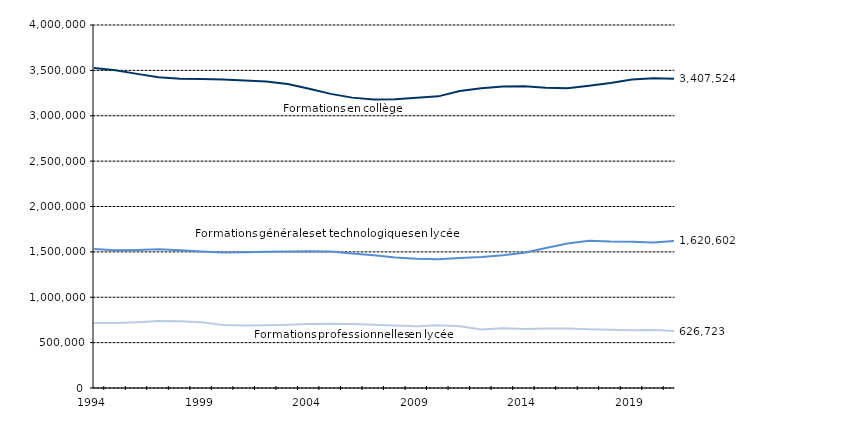
| Category | 1ER CYCLE | 2ND CYCLE G&T | 2ND CYCLE PRO |
|---|---|---|---|
| 1994.0 | 3525571 | 1532416 | 715528 |
| 1995.0 | 3500583 | 1517133 | 715162 |
| 1996.0 | 3461476 | 1521263 | 725673 |
| 1997.0 | 3425360 | 1528818 | 737118 |
| 1998.0 | 3408484 | 1517182 | 736824 |
| 1999.0 | 3404370 | 1505298 | 725432 |
| 2000.0 | 3400023 | 1493869 | 694489 |
| 2001.0 | 3388123 | 1496811 | 688675 |
| 2002.0 | 3376435 | 1502152 | 690870 |
| 2003.0 | 3350174 | 1503267 | 698111 |
| 2004.0 | 3298105 | 1507439 | 705227 |
| 2005.0 | 3241182 | 1504878 | 708813 |
| 2006.0 | 3199668 | 1483015 | 704518 |
| 2007.0 | 3180327 | 1461505 | 697545 |
| 2008.0 | 3181818 | 1438506 | 687699 |
| 2009.0 | 3198401 | 1423264 | 679481 |
| 2010.0 | 3213527 | 1417634 | 690920 |
| 2011.0 | 3271956 | 1431834 | 680066 |
| 2012.0 | 3303291 | 1444067 | 644084 |
| 2013.0 | 3322932 | 1462735 | 657343 |
| 2014.0 | 3326313 | 1491243 | 651302 |
| 2015.0 | 3308927 | 1543125 | 656864 |
| 2016.0 | 3304350 | 1591362 | 656222 |
| 2017.0 | 3331338 | 1622917 | 648637 |
| 2018.0 | 3361511 | 1614021 | 640875 |
| 2019.0 | 3398550 | 1611694 | 636692 |
| 2020.0 | 3414359 | 1604358 | 638326 |
| 2021.0 | 3407524 | 1620602 | 626723 |